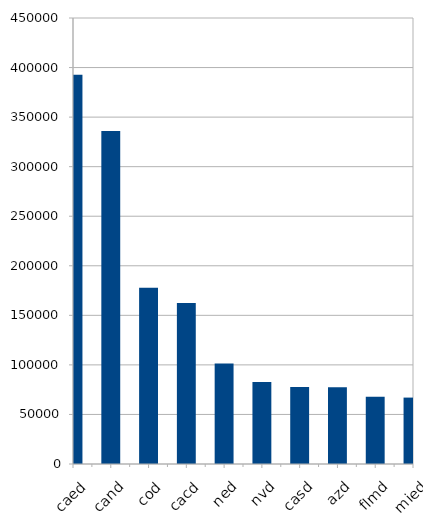
| Category | Series 0 |
|---|---|
| caed | 392825 |
| cand | 335951 |
| cod | 177733 |
| cacd | 162421 |
| ned | 101356 |
| nvd | 82620 |
| casd | 77582 |
| azd | 77534 |
| flmd | 67898 |
| mied | 67006 |